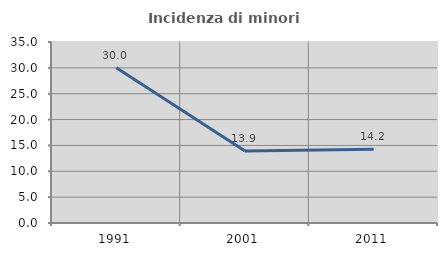
| Category | Incidenza di minori stranieri |
|---|---|
| 1991.0 | 30 |
| 2001.0 | 13.939 |
| 2011.0 | 14.246 |